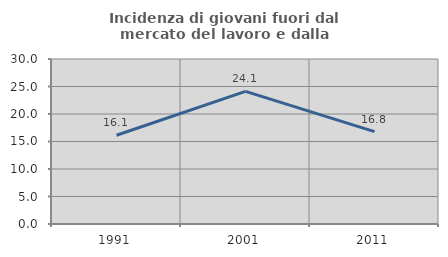
| Category | Incidenza di giovani fuori dal mercato del lavoro e dalla formazione  |
|---|---|
| 1991.0 | 16.141 |
| 2001.0 | 24.102 |
| 2011.0 | 16.801 |